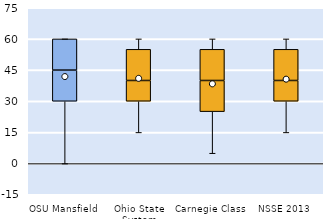
| Category | 25th | 50th | 75th |
|---|---|---|---|
| OSU Mansfield | 30 | 15 | 15 |
| Ohio State System | 30 | 10 | 15 |
| Carnegie Class | 25 | 15 | 15 |
| NSSE 2013 | 30 | 10 | 15 |